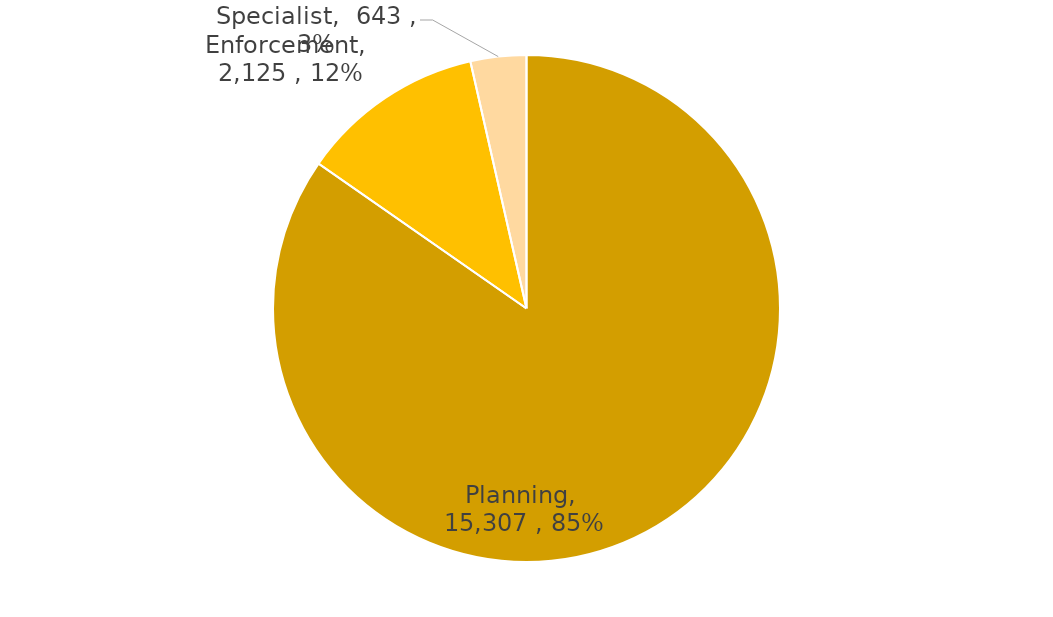
| Category | Series 0 |
|---|---|
| Planning | 15307 |
| Enforcement | 2125 |
| Specialist | 643 |